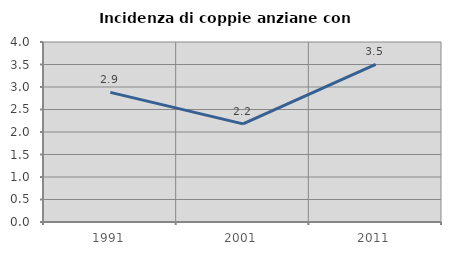
| Category | Incidenza di coppie anziane con figli |
|---|---|
| 1991.0 | 2.881 |
| 2001.0 | 2.181 |
| 2011.0 | 3.504 |